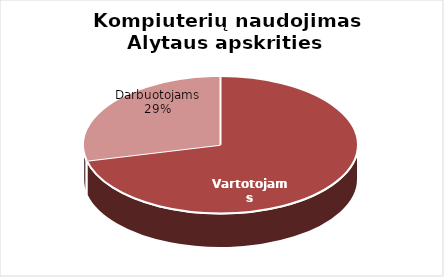
| Category | Series 0 |
|---|---|
| Vartotojams | 474 |
| Darbuotojams | 191 |